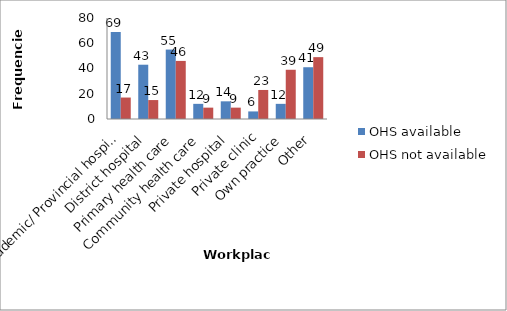
| Category | OHS available | OHS not available |
|---|---|---|
| Academic/ Provincial hospital | 69 | 17 |
| District hospital | 43 | 15 |
| Primary health care | 55 | 46 |
| Community health care | 12 | 9 |
| Private hospital | 14 | 9 |
| Private clinic | 6 | 23 |
| Own practice | 12 | 39 |
| Other | 41 | 49 |